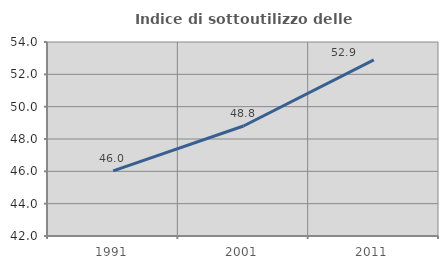
| Category | Indice di sottoutilizzo delle abitazioni  |
|---|---|
| 1991.0 | 46.026 |
| 2001.0 | 48.802 |
| 2011.0 | 52.89 |